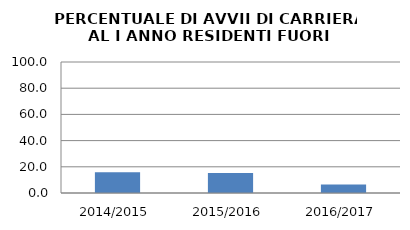
| Category | 2014/2015 2015/2016 2016/2017 |
|---|---|
| 2014/2015 | 15.924 |
| 2015/2016 | 15.337 |
| 2016/2017 | 6.542 |